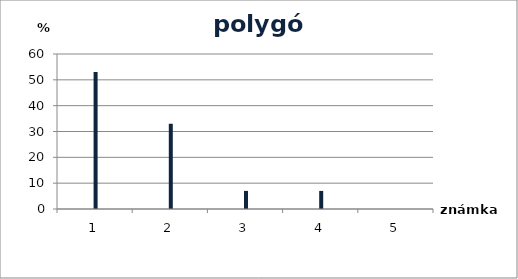
| Category | per.ž |
|---|---|
| 0 | 53 |
| 1 | 33 |
| 2 | 7 |
| 3 | 7 |
| 4 | 0 |